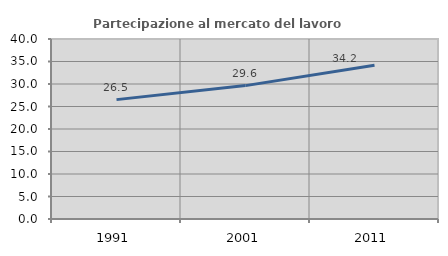
| Category | Partecipazione al mercato del lavoro  femminile |
|---|---|
| 1991.0 | 26.526 |
| 2001.0 | 29.642 |
| 2011.0 | 34.161 |